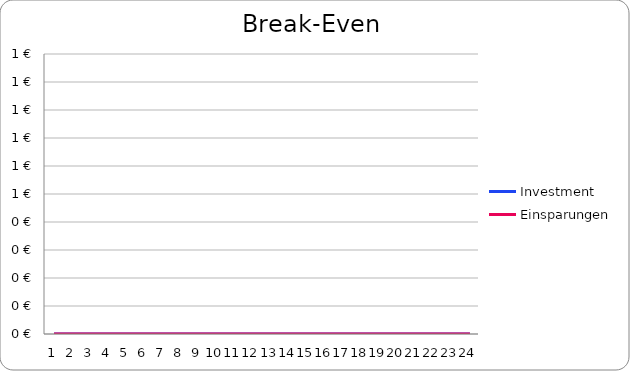
| Category | Investment | Einsparungen |
|---|---|---|
| 0 | 0 | 0 |
| 1 | 0 | 0 |
| 2 | 0 | 0 |
| 3 | 0 | 0 |
| 4 | 0 | 0 |
| 5 | 0 | 0 |
| 6 | 0 | 0 |
| 7 | 0 | 0 |
| 8 | 0 | 0 |
| 9 | 0 | 0 |
| 10 | 0 | 0 |
| 11 | 0 | 0 |
| 12 | 0 | 0 |
| 13 | 0 | 0 |
| 14 | 0 | 0 |
| 15 | 0 | 0 |
| 16 | 0 | 0 |
| 17 | 0 | 0 |
| 18 | 0 | 0 |
| 19 | 0 | 0 |
| 20 | 0 | 0 |
| 21 | 0 | 0 |
| 22 | 0 | 0 |
| 23 | 0 | 0 |